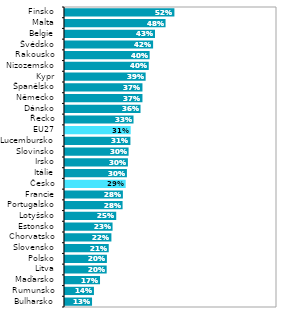
| Category | Series 0 |
|---|---|
| Bulharsko | 0.132 |
| Rumunsko | 0.141 |
| Maďarsko | 0.17 |
| Litva | 0.201 |
| Polsko | 0.202 |
| Slovensko | 0.211 |
| Chorvatsko | 0.224 |
| Estonsko | 0.229 |
| Lotyšsko | 0.246 |
| Portugalsko | 0.276 |
| Francie | 0.278 |
| Česko | 0.291 |
| Itálie | 0.297 |
| Irsko | 0.301 |
| Slovinsko | 0.305 |
| Lucembursko | 0.313 |
| EU27 | 0.315 |
| Řecko | 0.328 |
| Dánsko | 0.361 |
| Německo | 0.37 |
| Španělsko | 0.37 |
| Kypr | 0.385 |
| Nizozemsko | 0.4 |
| Rakousko | 0.404 |
| Švédsko | 0.42 |
| Belgie | 0.429 |
| Malta | 0.479 |
| Finsko | 0.521 |